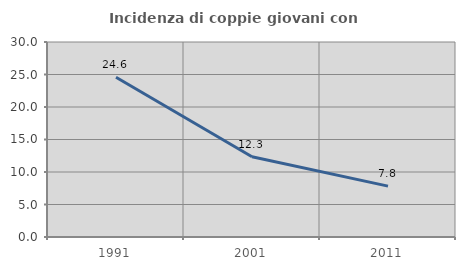
| Category | Incidenza di coppie giovani con figli |
|---|---|
| 1991.0 | 24.589 |
| 2001.0 | 12.34 |
| 2011.0 | 7.827 |